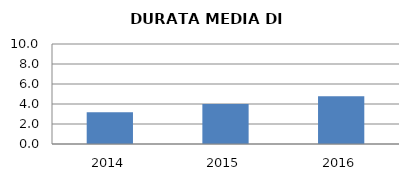
| Category | 2014 2015 2016 |
|---|---|
| 2014.0 | 3.182 |
| 2015.0 | 4 |
| 2016.0 | 4.769 |